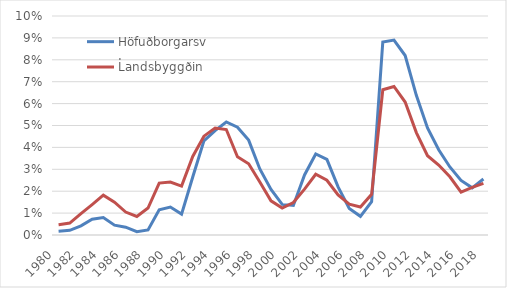
| Category | Höfuðborgarsv. | Landsbyggðin |
|---|---|---|
| 1980.0 | 0.177 | 0.473 |
| 1981.0 | 0.215 | 0.546 |
| 1982.0 | 0.419 | 0.976 |
| 1983.0 | 0.724 | 1.389 |
| 1984.0 | 0.797 | 1.818 |
| 1985.0 | 0.451 | 1.499 |
| 1986.0 | 0.356 | 1.048 |
| 1987.0 | 0.148 | 0.846 |
| 1988.0 | 0.231 | 1.231 |
| 1989.0 | 1.148 | 2.37 |
| 1990.0 | 1.274 | 2.418 |
| 1991.0 | 0.956 | 2.232 |
| 1992.0 | 2.649 | 3.587 |
| 1993.0 | 4.297 | 4.513 |
| 1994.0 | 4.769 | 4.887 |
| 1995.0 | 5.162 | 4.816 |
| 1996.0 | 4.92 | 3.575 |
| 1997.0 | 4.334 | 3.254 |
| 1998.0 | 3.014 | 2.416 |
| 1999.0 | 2.078 | 1.559 |
| 2000.0 | 1.397 | 1.229 |
| 2001.0 | 1.349 | 1.484 |
| 2002.0 | 2.742 | 2.093 |
| 2003.0 | 3.701 | 2.774 |
| 2004.0 | 3.451 | 2.501 |
| 2005.0 | 2.197 | 1.827 |
| 2006.0 | 1.209 | 1.411 |
| 2007.0 | 0.852 | 1.275 |
| 2008.0 | 1.525 | 1.857 |
| 2009.0 | 8.814 | 6.633 |
| 2010.0 | 8.903 | 6.782 |
| 2011.0 | 8.195 | 6.071 |
| 2012.0 | 6.379 | 4.678 |
| 2013.0 | 4.889 | 3.621 |
| 2014.0 | 3.893 | 3.192 |
| 2015.0 | 3.106 | 2.656 |
| 2016.0 | 2.49 | 1.96 |
| 2017.0 | 2.155 | 2.179 |
| 2018.0 | 2.558 | 2.357 |